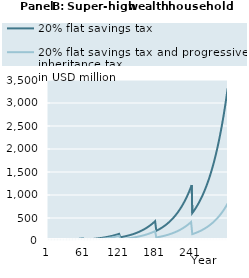
| Category | 20% flat savings tax | 20% flat savings tax and progressive inheritance tax |
|---|---|---|
| 1 | 10000000 | 10000000 |
| 2 | 10314750 | 10314750 |
| 3 | 10638690.7 | 10638690.7 |
| 4 | 10972090.468 | 10972090.468 |
| 5 | 11315225.51 | 11315225.51 |
| 6 | 11668380.095 | 11668380.095 |
| 7 | 12031846.794 | 12031846.794 |
| 8 | 12405926.72 | 12405926.72 |
| 9 | 12790929.78 | 12790929.78 |
| 10 | 13187174.93 | 13187174.93 |
| 11 | 13594990.438 | 13594990.438 |
| 12 | 14014714.159 | 14014714.159 |
| 13 | 14446693.812 | 14446693.812 |
| 14 | 14891287.271 | 14891287.271 |
| 15 | 15348862.86 | 15348862.86 |
| 16 | 15819799.655 | 15819799.655 |
| 17 | 16304487.805 | 16304487.805 |
| 18 | 16803328.849 | 16803328.849 |
| 19 | 17316736.052 | 17316736.052 |
| 20 | 17845134.744 | 17845134.744 |
| 21 | 18388962.679 | 18388962.679 |
| 22 | 18948670.389 | 18948670.389 |
| 23 | 19524721.564 | 19524721.564 |
| 24 | 20117593.434 | 20117593.434 |
| 25 | 20727777.162 | 20727777.162 |
| 26 | 21355778.255 | 21355778.255 |
| 27 | 22002116.981 | 22002116.981 |
| 28 | 22667328.796 | 22667328.796 |
| 29 | 23351964.797 | 23351964.797 |
| 30 | 24056592.169 | 24056592.169 |
| 31 | 24781794.661 | 24781794.661 |
| 32 | 25528173.065 | 25528173.065 |
| 33 | 26296345.718 | 26296345.718 |
| 34 | 27086949.013 | 27086949.013 |
| 35 | 27900637.924 | 27900637.924 |
| 36 | 28738086.552 | 28738086.552 |
| 37 | 29599988.679 | 29599988.679 |
| 38 | 30487058.349 | 30487058.349 |
| 39 | 31400030.452 | 31400030.452 |
| 40 | 32339661.341 | 32339661.341 |
| 41 | 33306729.453 | 33306729.453 |
| 42 | 34290485.953 | 34290485.953 |
| 43 | 35302968.142 | 35302968.142 |
| 44 | 36345014.812 | 36345014.812 |
| 45 | 37417489.245 | 37417489.245 |
| 46 | 38521279.931 | 38521279.931 |
| 47 | 39657301.305 | 39657301.305 |
| 48 | 40826494.503 | 40826494.503 |
| 49 | 42029828.142 | 42029828.142 |
| 50 | 43268299.124 | 43268299.124 |
| 51 | 44542933.458 | 44542933.458 |
| 52 | 45854787.115 | 45854787.115 |
| 53 | 47204946.899 | 47204946.899 |
| 54 | 48594531.349 | 48594531.349 |
| 55 | 50024691.664 | 50024691.664 |
| 56 | 51496612.661 | 51496612.661 |
| 57 | 53011513.75 | 53011513.75 |
| 58 | 54570649.952 | 54570649.952 |
| 59 | 56175312.93 | 56175312.93 |
| 60 | 57826832.068 | 57826832.068 |
| 61 | 28913416.034 | 20239391.224 |
| 62 | 29780437.782 | 20853131.448 |
| 63 | 30672776.565 | 21484792.886 |
| 64 | 31591171.641 | 22134898.838 |
| 65 | 32536383.853 | 22803987.884 |
| 66 | 33509196.262 | 23492614.33 |
| 67 | 34510414.792 | 24201348.669 |
| 68 | 35540868.904 | 24930778.05 |
| 69 | 36601412.276 | 25681506.769 |
| 70 | 37692923.515 | 26454156.767 |
| 71 | 38816306.881 | 27249368.144 |
| 72 | 39972493.042 | 28067799.694 |
| 73 | 41162439.839 | 28910129.445 |
| 74 | 42387133.083 | 29777055.225 |
| 75 | 43647587.369 | 30669295.237 |
| 76 | 44944846.92 | 31587588.658 |
| 77 | 46279986.45 | 32532696.247 |
| 78 | 47654112.054 | 33505400.978 |
| 79 | 49068362.126 | 34506508.686 |
| 80 | 50523908.3 | 35536848.74 |
| 81 | 52021956.423 | 36597274.723 |
| 82 | 53563747.55 | 37688665.145 |
| 83 | 55150558.979 | 38811924.167 |
| 84 | 56783705.301 | 39967982.353 |
| 85 | 58464539.495 | 41157797.438 |
| 86 | 60194454.049 | 42382355.123 |
| 87 | 61974882.107 | 43642669.892 |
| 88 | 63807298.664 | 44939785.853 |
| 89 | 65693221.785 | 46274777.6 |
| 90 | 67634213.862 | 47648751.106 |
| 91 | 69631882.906 | 49062844.638 |
| 92 | 71687883.887 | 50518229.702 |
| 93 | 73803920.097 | 52016112.009 |
| 94 | 75981744.564 | 53557732.48 |
| 95 | 78223161.505 | 55144368.268 |
| 96 | 80530027.821 | 56777333.822 |
| 97 | 82904254.633 | 58457981.969 |
| 98 | 85347808.868 | 60187705.043 |
| 99 | 87862714.887 | 61967936.03 |
| 100 | 90451056.162 | 63800149.762 |
| 101 | 93114977.002 | 65685864.135 |
| 102 | 95845134.331 | 67615091.368 |
| 103 | 98655012.253 | 69600652.036 |
| 104 | 101546938.611 | 71644191.075 |
| 105 | 104523309.218 | 73747401.455 |
| 106 | 107586589.847 | 75912025.577 |
| 107 | 110739318.271 | 78139856.724 |
| 108 | 113984106.364 | 80432740.54 |
| 109 | 117323642.27 | 82792576.564 |
| 110 | 120760692.625 | 85221319.8 |
| 111 | 124298104.849 | 87720982.338 |
| 112 | 127938809.511 | 90293635.022 |
| 113 | 131685822.748 | 92941409.165 |
| 114 | 135542248.773 | 95666498.312 |
| 115 | 139511282.437 | 98471160.063 |
| 116 | 143596211.884 | 101357717.937 |
| 117 | 147800421.271 | 104328563.301 |
| 118 | 152127393.572 | 107386157.349 |
| 119 | 156580713.464 | 110533033.144 |
| 120 | 161164070.298 | 113771797.711 |
| 121 | 80582035.149 | 39820129.199 |
| 122 | 82957780.575 | 41005626.972 |
| 123 | 85402897.768 | 42225741.279 |
| 124 | 87919412.383 | 43481482.925 |
| 125 | 90509409.224 | 44773892.226 |
| 126 | 93175033.974 | 46104039.879 |
| 127 | 95918494.966 | 47473027.843 |
| 128 | 98742065.019 | 48881990.256 |
| 129 | 101648083.317 | 50332094.372 |
| 130 | 104638957.35 | 51824541.528 |
| 131 | 107717164.905 | 53360568.14 |
| 132 | 110885256.12 | 54941446.73 |
| 133 | 114145855.599 | 56568486.974 |
| 134 | 117501664.582 | 58243036.794 |
| 135 | 120955463.188 | 59966483.468 |
| 136 | 124510112.713 | 61740254.786 |
| 137 | 128168558.004 | 63565820.225 |
| 138 | 131933829.898 | 65444692.176 |
| 139 | 135809047.731 | 67378427.188 |
| 140 | 139797421.925 | 69368627.261 |
| 141 | 143902256.645 | 71416941.177 |
| 142 | 148126952.539 | 73525065.86 |
| 143 | 152475009.553 | 75694747.783 |
| 144 | 156950029.832 | 77927784.418 |
| 145 | 161555720.703 | 80226025.723 |
| 146 | 166295897.748 | 82591375.674 |
| 147 | 171174487.962 | 85025793.844 |
| 148 | 176195533.011 | 87531297.024 |
| 149 | 181363192.574 | 90109960.897 |
| 150 | 186681747.798 | 92763921.756 |
| 151 | 192155604.833 | 95495378.271 |
| 152 | 197789298.494 | 98306593.316 |
| 153 | 203587496.01 | 101199895.841 |
| 154 | 209555000.894 | 104177682.8 |
| 155 | 215696756.92 | 107242421.137 |
| 156 | 222017852.222 | 110396649.835 |
| 157 | 228523523.507 | 113642982.01 |
| 158 | 235219160.393 | 116984107.085 |
| 159 | 242110309.877 | 120422793.011 |
| 160 | 249202680.925 | 123961888.567 |
| 161 | 256502149.208 | 127604325.713 |
| 162 | 264003211.965 | 131341572.024 |
| 163 | 271723305.755 | 135187945.927 |
| 164 | 279668826.283 | 139146633.949 |
| 165 | 287846356.01 | 143220915.66 |
| 166 | 296262669.606 | 147414166.397 |
| 167 | 304924739.558 | 151729860.056 |
| 168 | 313839741.953 | 156171571.969 |
| 169 | 323015062.418 | 160742981.871 |
| 170 | 332458302.241 | 165447876.942 |
| 171 | 342177284.666 | 170290154.948 |
| 172 | 352180061.378 | 175273827.473 |
| 173 | 362474919.171 | 180403023.235 |
| 174 | 373070386.811 | 185681991.513 |
| 175 | 383975242.105 | 191115105.666 |
| 176 | 395198519.175 | 196706866.751 |
| 177 | 406749515.935 | 202461907.26 |
| 178 | 418637801.8 | 208384994.952 |
| 179 | 430873225.613 | 214481036.805 |
| 180 | 443465923.8 | 220755083.08 |
| 181 | 221732961.9 | 77264279.078 |
| 182 | 228230314.388 | 79543146.027 |
| 183 | 234917389.568 | 81888555.891 |
| 184 | 241799727.343 | 84302451.723 |
| 185 | 248883029.382 | 86786833.313 |
| 186 | 256173163.84 | 89343758.846 |
| 187 | 263676170.224 | 91975346.604 |
| 188 | 271398264.394 | 94683776.725 |
| 189 | 279345843.715 | 97471293.006 |
| 190 | 287525492.351 | 100340204.761 |
| 191 | 295943986.728 | 103292888.74 |
| 192 | 304608301.14 | 106331791.092 |
| 193 | 313525613.533 | 109459429.391 |
| 194 | 322703311.449 | 112678394.73 |
| 195 | 332148998.143 | 115991353.856 |
| 196 | 341870498.889 | 119401051.388 |
| 197 | 351875867.456 | 122910312.089 |
| 198 | 362173392.786 | 126522043.202 |
| 199 | 372771605.855 | 130239236.863 |
| 200 | 383679286.746 | 134064972.58 |
| 201 | 394905471.919 | 138002419.779 |
| 202 | 406459461.699 | 142054840.437 |
| 203 | 418350827.981 | 146225591.777 |
| 204 | 430589422.158 | 150518129.057 |
| 205 | 443185383.285 | 154936008.426 |
| 206 | 456149146.477 | 159482889.872 |
| 207 | 469491451.554 | 164162540.256 |
| 208 | 483223351.939 | 168978836.431 |
| 209 | 497356223.816 | 173935768.455 |
| 210 | 511901775.551 | 179037442.894 |
| 211 | 526872057.398 | 184288086.227 |
| 212 | 542279471.474 | 189692048.345 |
| 213 | 558136782.041 | 195253806.156 |
| 214 | 574457126.076 | 200977967.296 |
| 215 | 591254024.158 | 206869273.941 |
| 216 | 608541391.663 | 212932606.74 |
| 217 | 626333550.3 | 219172988.857 |
| 218 | 644645239.968 | 225595590.131 |
| 219 | 663491630.975 | 232205731.363 |
| 220 | 682888336.6 | 239008888.719 |
| 221 | 702851426.029 | 246010698.27 |
| 222 | 723385887.669 | 253205410.659 |
| 223 | 744519955.589 | 260610208.65 |
| 224 | 766271138.292 | 268231226.743 |
| 225 | 788657455.53 | 276074778.564 |
| 226 | 811697453.231 | 284147362.098 |
| 227 | 835410218.866 | 292455665.071 |
| 228 | 859815397.257 | 301006570.491 |
| 229 | 884933206.856 | 309807162.35 |
| 230 | 910784456.497 | 318864731.49 |
| 231 | 937390562.626 | 328186781.65 |
| 232 | 964773567.055 | 337781035.674 |
| 233 | 992956155.213 | 347655441.916 |
| 234 | 1021961674.945 | 357818180.82 |
| 235 | 1051814155.854 | 368277671.7 |
| 236 | 1082538329.205 | 379042579.713 |
| 237 | 1114159648.417 | 390121823.041 |
| 238 | 1146704310.151 | 401524580.274 |
| 239 | 1180199276.008 | 413260298.018 |
| 240 | 1214672294.867 | 425338698.72 |
| 241 | 607336147.433 | 148868544.552 |
| 242 | 625093112.939 | 153238256.053 |
| 243 | 643368581.836 | 157735563.13 |
| 244 | 662177694.426 | 162364191.573 |
| 245 | 681536033.103 | 167127975.967 |
| 246 | 701459635.27 | 172030862.865 |
| 247 | 721965006.62 | 177076914.061 |
| 248 | 743069134.813 | 182270309.951 |
| 249 | 764789503.55 | 187615353.002 |
| 250 | 787144107.053 | 193116471.31 |
| 251 | 810151464.979 | 198778222.272 |
| 252 | 833830637.757 | 204605296.362 |
| 253 | 858201242.379 | 210602521.016 |
| 254 | 883283468.656 | 216774864.63 |
| 255 | 909098095.941 | 223127440.677 |
| 256 | 935666510.343 | 229665511.945 |
| 257 | 963010722.445 | 236394494.893 |
| 258 | 991153385.54 | 243319964.144 |
| 259 | 1020117814.398 | 250447657.097 |
| 260 | 1049928004.578 | 257783478.684 |
| 261 | 1080608652.312 | 265333506.262 |
| 262 | 1112185174.96 | 273103994.645 |
| 263 | 1144683732.068 | 281101381.289 |
| 264 | 1178131247.045 | 289332291.622 |
| 265 | 1212555429.458 | 297803544.538 |
| 266 | 1247984797.999 | 306522158.038 |
| 267 | 1284448704.1 | 315495355.053 |
| 268 | 1321977356.26 | 324730569.42 |
| 269 | 1360601845.063 | 334235452.047 |
| 270 | 1400354168.939 | 344017877.247 |
| 271 | 1441267260.672 | 354085949.263 |
| 272 | 1483375014.683 | 364448008.981 |
| 273 | 1526712315.112 | 375112640.843 |
| 274 | 1571315064.713 | 386088679.956 |
| 275 | 1617220214.603 | 397385219.411 |
| 276 | 1664465794.869 | 409011617.818 |
| 277 | 1713090946.079 | 420977507.058 |
| 278 | 1763135951.705 | 433292800.264 |
| 279 | 1814642271.495 | 445967700.032 |
| 280 | 1867652575.822 | 459012706.873 |
| 281 | 1922210781.036 | 472438627.913 |
| 282 | 1978350535.843 | 486245035.848 |
| 283 | 2036129571.489 | 500454590.895 |
| 284 | 2095595754.977 | 515079064.949 |
| 285 | 2156798351.022 | 530130573.646 |
| 286 | 2219788062.872 | 545621586.396 |
| 287 | 2284617074.308 | 561564936.719 |
| 288 | 2351339092.878 | 577973832.871 |
| 289 | 2420009394.39 | 594861868.791 |
| 290 | 2490684868.706 | 612243035.36 |
| 291 | 2563424066.872 | 630131731.992 |
| 292 | 2638287249.625 | 648542778.566 |
| 293 | 2715336437.314 | 667491427.701 |
| 294 | 2794635461.283 | 686993377.389 |
| 295 | 2876250016.753 | 707064784.009 |
| 296 | 2960247717.242 | 727722275.702 |
| 297 | 3046698150.585 | 748982966.153 |
| 298 | 3135672936.582 | 770864468.764 |
| 299 | 3227245786.331 | 793384911.252 |
| 300 | 3321492563.291 | 816562950.661 |